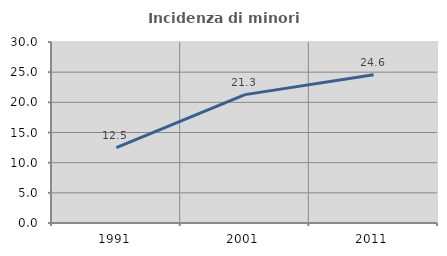
| Category | Incidenza di minori stranieri |
|---|---|
| 1991.0 | 12.5 |
| 2001.0 | 21.277 |
| 2011.0 | 24.561 |